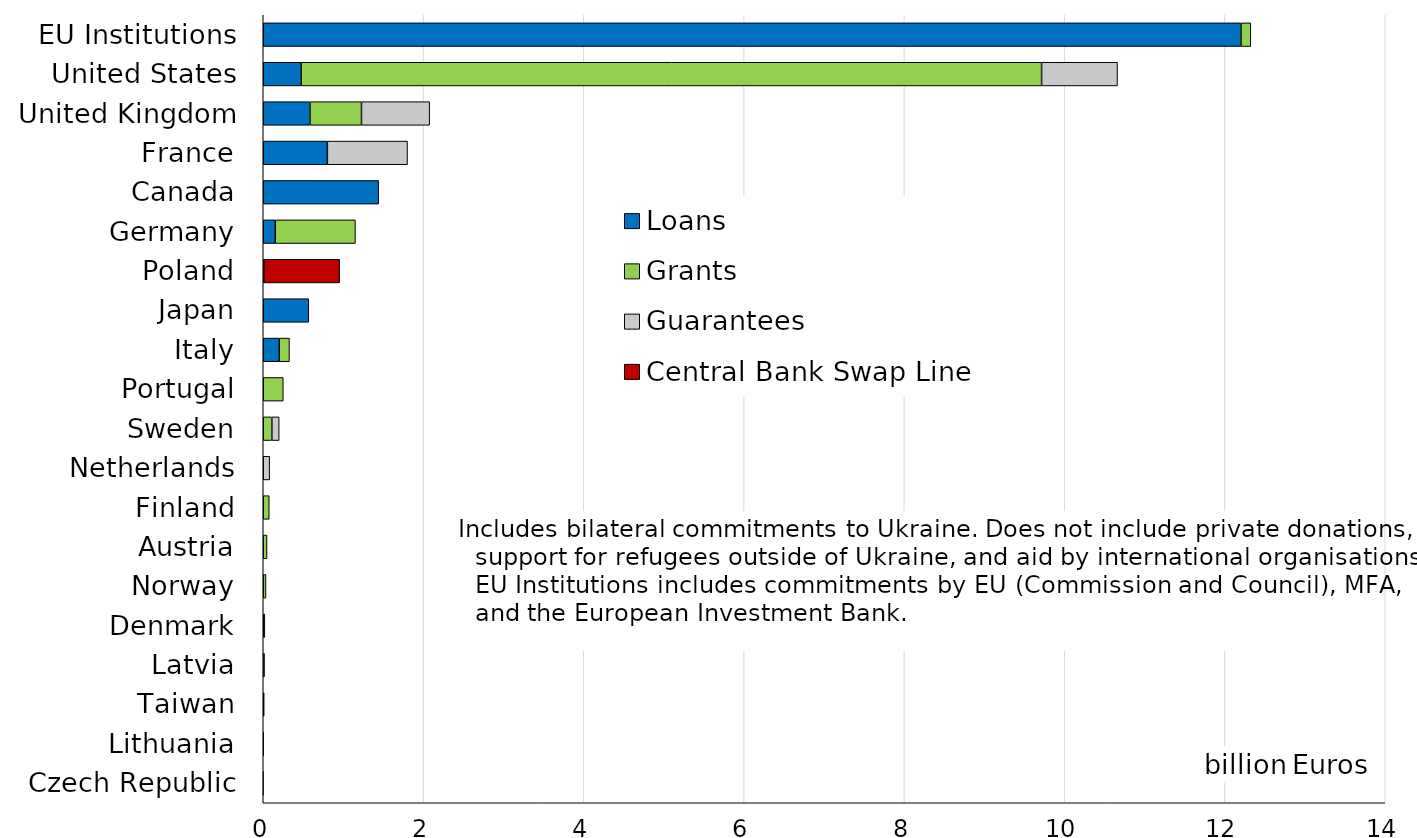
| Category | Loans | Grants | Guarantees | Central Bank Swap Line |
|---|---|---|---|---|
| EU Institutions | 12.2 | 0.122 | 0 | 0 |
| United States | 0.473 | 9.239 | 0.947 | 0 |
| United Kingdom | 0.583 | 0.643 | 0.851 | 0 |
| France | 0.8 | 0 | 1 | 0 |
| Canada | 1.441 | 0 | 0 | 0 |
| Germany | 0.15 | 1 | 0 | 0 |
| Poland | 0 | 0.006 | 0 | 0.947 |
| Japan | 0.568 | 0 | 0 | 0 |
| Italy | 0.2 | 0.127 | 0 | 0 |
| Portugal | 0 | 0.25 | 0 | 0 |
| Sweden | 0 | 0.107 | 0.091 | 0 |
| Netherlands | 0 | 0 | 0.08 | 0 |
| Finland | 0 | 0.075 | 0 | 0 |
| Austria | 0 | 0.047 | 0 | 0 |
| Norway | 0 | 0.034 | 0 | 0 |
| Denmark | 0 | 0.02 | 0 | 0 |
| Latvia | 0 | 0.005 | 0.01 | 0 |
| Taiwan | 0 | 0.012 | 0 | 0 |
| Lithuania | 0 | 0.005 | 0 | 0 |
| Czech Republic | 0 | 0 | 0 | 0 |